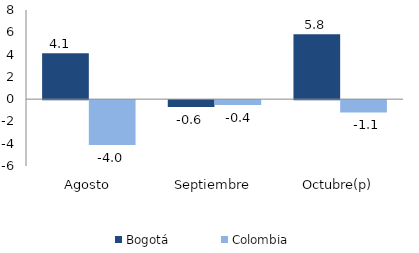
| Category | Bogotá | Colombia |
|---|---|---|
| Agosto | 4.121 | -4.031 |
| Septiembre | -0.606 | -0.434 |
| Octubre(p) | 5.831 | -1.109 |